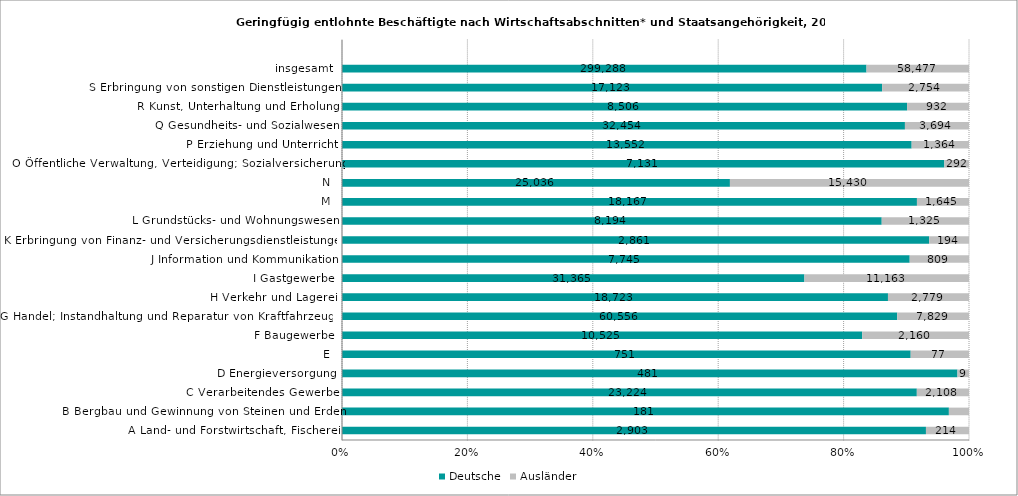
| Category | Deutsche | Ausländer |
|---|---|---|
| A Land- und Forstwirtschaft, Fischerei | 2903 | 214 |
| B Bergbau und Gewinnung von Steinen und Erden | 181 | 6 |
| C Verarbeitendes Gewerbe | 23224 | 2108 |
| D Energieversorgung | 481 | 9 |
| E | 751 | 77 |
| F Baugewerbe | 10525 | 2160 |
| G Handel; Instandhaltung und Reparatur von Kraftfahrzeugen | 60556 | 7829 |
| H Verkehr und Lagerei | 18723 | 2779 |
| I Gastgewerbe | 31365 | 11163 |
| J Information und Kommunikation | 7745 | 809 |
| K Erbringung von Finanz- und Versicherungsdienstleistungen | 2861 | 194 |
| L Grundstücks- und Wohnungswesen | 8194 | 1325 |
| M | 18167 | 1645 |
| N | 25036 | 15430 |
| O Öffentliche Verwaltung, Verteidigung; Sozialversicherung | 7131 | 292 |
| P Erziehung und Unterricht | 13552 | 1364 |
| Q Gesundheits- und Sozialwesen | 32454 | 3694 |
| R Kunst, Unterhaltung und Erholung | 8506 | 932 |
| S Erbringung von sonstigen Dienstleistungen | 17123 | 2754 |
| insgesamt | 299288 | 58477 |